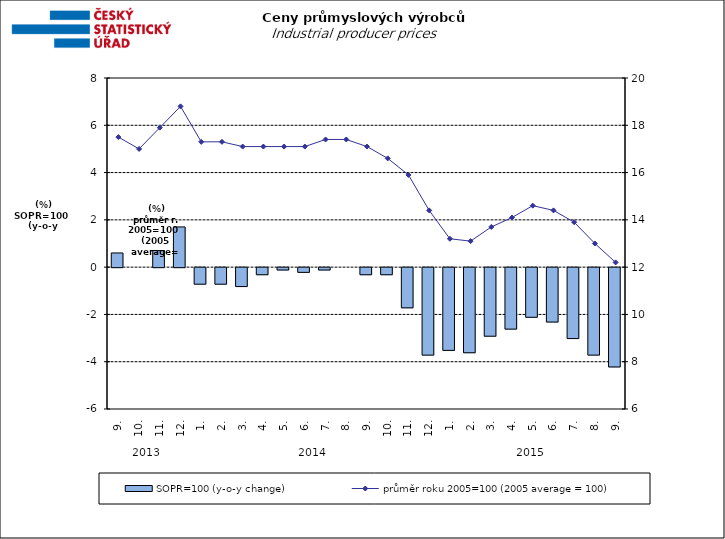
| Category | SOPR=100 (y-o-y change)   |
|---|---|
| 0 | 0.6 |
| 1 | 0 |
| 2 | 0.7 |
| 3 | 1.7 |
| 4 | -0.7 |
| 5 | -0.7 |
| 6 | -0.8 |
| 7 | -0.3 |
| 8 | -0.1 |
| 9 | -0.2 |
| 10 | -0.1 |
| 11 | 0 |
| 12 | -0.3 |
| 13 | -0.3 |
| 14 | -1.7 |
| 15 | -3.7 |
| 16 | -3.5 |
| 17 | -3.6 |
| 18 | -2.9 |
| 19 | -2.6 |
| 20 | -2.1 |
| 21 | -2.3 |
| 22 | -3 |
| 23 | -3.7 |
| 24 | -4.2 |